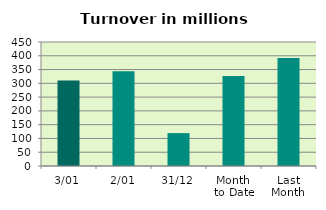
| Category | Series 0 |
|---|---|
| 3/01 | 309.97 |
| 2/01 | 343.533 |
| 31/12 | 119.341 |
| Month 
to Date | 326.751 |
| Last
Month | 391.769 |